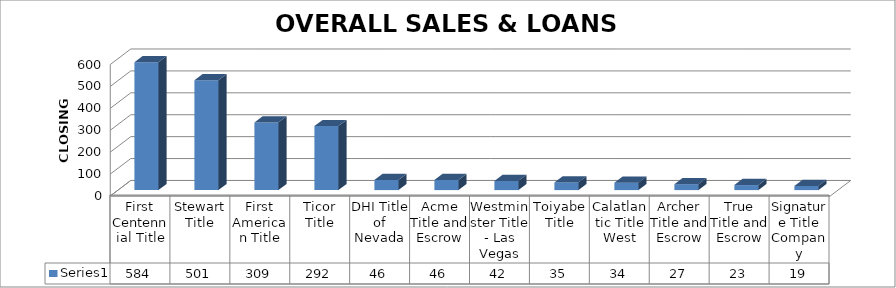
| Category | Series 0 |
|---|---|
| First Centennial Title | 584 |
| Stewart Title | 501 |
| First American Title | 309 |
| Ticor Title | 292 |
| DHI Title of Nevada | 46 |
| Acme Title and Escrow | 46 |
| Westminster Title - Las Vegas | 42 |
| Toiyabe Title | 35 |
| Calatlantic Title West | 34 |
| Archer Title and Escrow | 27 |
| True Title and Escrow | 23 |
| Signature Title Company | 19 |